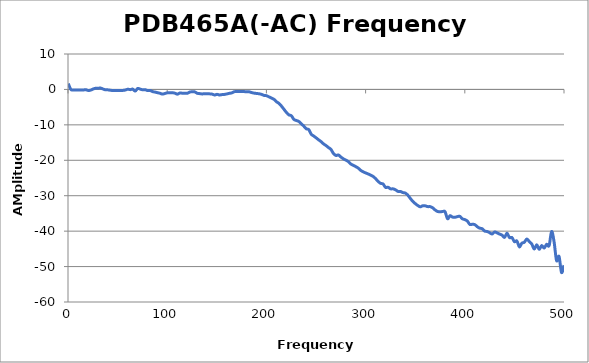
| Category | Series 0 |
|---|---|
| 0.3 | 1.651 |
| 2.7985 | 0.007 |
| 5.297 | -0.188 |
| 7.7955 | -0.171 |
| 10.294 | -0.185 |
| 12.7925 | -0.195 |
| 15.291 | -0.175 |
| 17.7895 | -0.066 |
| 20.288 | -0.291 |
| 22.7865 | -0.205 |
| 25.285 | 0.105 |
| 27.7835 | 0.326 |
| 30.282 | 0.34 |
| 32.7805 | 0.383 |
| 35.279 | 0.122 |
| 37.7775 | -0.106 |
| 40.276 | -0.125 |
| 42.7745 | -0.239 |
| 45.273 | -0.296 |
| 47.7715 | -0.312 |
| 50.27 | -0.31 |
| 52.7685 | -0.304 |
| 55.267 | -0.281 |
| 57.7655 | -0.165 |
| 60.264 | 0.055 |
| 62.7625 | -0.062 |
| 65.261 | 0.091 |
| 67.7595 | -0.473 |
| 70.258 | 0.279 |
| 72.7565 | 0.082 |
| 75.255 | -0.105 |
| 77.7535 | -0.084 |
| 80.252 | -0.311 |
| 82.7505 | -0.297 |
| 85.249 | -0.617 |
| 87.7475 | -0.75 |
| 90.246 | -0.921 |
| 92.7445 | -1.089 |
| 95.243 | -1.323 |
| 97.7415 | -1.141 |
| 100.24 | -0.96 |
| 102.7385 | -0.963 |
| 105.237 | -0.933 |
| 107.7355 | -1.062 |
| 110.234 | -1.34 |
| 112.7325 | -1.018 |
| 115.231 | -1.067 |
| 117.7295 | -1.051 |
| 120.228 | -1.096 |
| 122.7265 | -0.741 |
| 125.225 | -0.667 |
| 127.7235 | -0.685 |
| 130.222 | -1.085 |
| 132.7205 | -1.187 |
| 135.219 | -1.268 |
| 137.7175 | -1.213 |
| 140.216 | -1.248 |
| 142.7145 | -1.254 |
| 145.213 | -1.316 |
| 147.7115 | -1.568 |
| 150.21 | -1.388 |
| 152.7085 | -1.564 |
| 155.207 | -1.459 |
| 157.7055 | -1.409 |
| 160.204 | -1.266 |
| 162.7025 | -1.095 |
| 165.201 | -0.974 |
| 167.6995 | -0.639 |
| 170.198 | -0.598 |
| 172.6965 | -0.574 |
| 175.195 | -0.574 |
| 177.6935 | -0.61 |
| 180.192 | -0.671 |
| 182.6905 | -0.669 |
| 185.189 | -0.895 |
| 187.6875 | -1.043 |
| 190.186 | -1.146 |
| 192.6845 | -1.228 |
| 195.183 | -1.406 |
| 197.6815 | -1.686 |
| 200.18 | -1.779 |
| 202.6785 | -2.111 |
| 205.177 | -2.435 |
| 207.6755 | -2.812 |
| 210.174 | -3.483 |
| 212.6725 | -3.934 |
| 215.171 | -4.704 |
| 217.6695 | -5.595 |
| 220.168 | -6.491 |
| 222.6665 | -7.186 |
| 225.165 | -7.425 |
| 227.6635 | -8.456 |
| 230.162 | -8.765 |
| 232.6605 | -9.044 |
| 235.159 | -9.693 |
| 237.6575 | -10.347 |
| 240.156 | -11.113 |
| 242.6545 | -11.325 |
| 245.153 | -12.619 |
| 247.6515 | -13.151 |
| 250.15 | -13.668 |
| 252.6485 | -14.229 |
| 255.147 | -14.746 |
| 257.6455 | -15.377 |
| 260.144 | -15.849 |
| 262.6425 | -16.421 |
| 265.141 | -16.942 |
| 267.6395 | -18.116 |
| 270.138 | -18.631 |
| 272.6365 | -18.512 |
| 275.135 | -19.084 |
| 277.6335 | -19.591 |
| 280.132 | -19.949 |
| 282.6305 | -20.372 |
| 285.129 | -21.048 |
| 287.6275 | -21.43 |
| 290.126 | -21.798 |
| 292.6245 | -22.225 |
| 295.123 | -22.852 |
| 297.6215 | -23.27 |
| 300.12 | -23.575 |
| 302.6185 | -23.862 |
| 305.117 | -24.195 |
| 307.6155 | -24.57 |
| 310.114 | -25.199 |
| 312.6125 | -25.951 |
| 315.111 | -26.518 |
| 317.6095 | -26.684 |
| 320.108 | -27.669 |
| 322.6065 | -27.608 |
| 325.105 | -28.056 |
| 327.6035 | -28.061 |
| 330.102 | -28.318 |
| 332.6005 | -28.773 |
| 335.099 | -28.792 |
| 337.5975 | -29.116 |
| 340.096 | -29.263 |
| 342.5945 | -29.852 |
| 345.093 | -30.779 |
| 347.5915 | -31.578 |
| 350.09 | -32.236 |
| 352.5885 | -32.756 |
| 355.087 | -33.136 |
| 357.5855 | -32.835 |
| 360.084 | -32.854 |
| 362.5825 | -33.078 |
| 365.081 | -33.081 |
| 367.5795 | -33.41 |
| 370.078 | -34.025 |
| 372.5765 | -34.446 |
| 375.075 | -34.536 |
| 377.5735 | -34.462 |
| 380.072 | -34.503 |
| 382.5705 | -36.494 |
| 385.069 | -35.634 |
| 387.5675 | -36.032 |
| 390.066 | -36.086 |
| 392.5645 | -35.896 |
| 395.063 | -35.832 |
| 397.5615 | -36.521 |
| 400.06 | -36.742 |
| 402.5585 | -37.151 |
| 405.057 | -38.112 |
| 407.5555 | -38.064 |
| 410.054 | -38.157 |
| 412.5525 | -38.749 |
| 415.051 | -39.161 |
| 417.5495 | -39.314 |
| 420.048 | -39.979 |
| 422.5465 | -40.103 |
| 425.045 | -40.438 |
| 427.5435 | -40.812 |
| 430.042 | -40.229 |
| 432.5405 | -40.48 |
| 435.039 | -40.819 |
| 437.5375 | -41.128 |
| 440.036 | -41.769 |
| 442.5345 | -40.564 |
| 445.033 | -41.815 |
| 447.5315 | -41.808 |
| 450.03 | -42.976 |
| 452.5285 | -42.78 |
| 455.027 | -44.464 |
| 457.5255 | -43.401 |
| 460.024 | -43.134 |
| 462.5225 | -42.217 |
| 465.021 | -42.959 |
| 467.5195 | -43.638 |
| 470.018 | -45.067 |
| 472.5165 | -43.84 |
| 475.015 | -45.146 |
| 477.5135 | -44.069 |
| 480.012 | -44.773 |
| 482.5105 | -43.717 |
| 485.009 | -44.064 |
| 487.5075 | -40.098 |
| 490.006 | -43.007 |
| 492.5045 | -48.319 |
| 495.003 | -47.14 |
| 497.5015 | -51.667 |
| 500.0 | -49.63 |